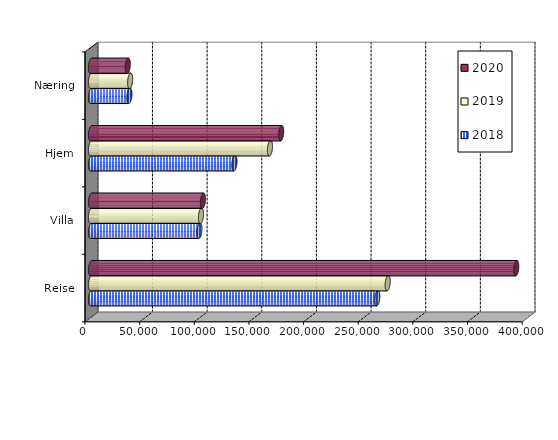
| Category | 2018 | 2019 | 2020 |
|---|---|---|---|
| Reise | 261928 | 271454.894 | 389077 |
| Villa | 99193.467 | 100639.434 | 102401.976 |
| Hjem | 131214.516 | 163732.571 | 173987.33 |
| Næring | 35114.516 | 35803.787 | 33616.306 |